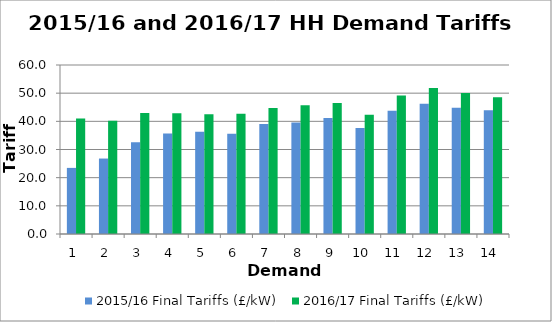
| Category | 2015/16 Final Tariffs (£/kW) | 2016/17 Final Tariffs (£/kW) |
|---|---|---|
| 1.0 | 23.469 | 40.966 |
| 2.0 | 26.789 | 40.244 |
| 3.0 | 32.618 | 42.928 |
| 4.0 | 35.683 | 42.828 |
| 5.0 | 36.288 | 42.494 |
| 6.0 | 35.621 | 42.678 |
| 7.0 | 39.066 | 44.725 |
| 8.0 | 39.63 | 45.739 |
| 9.0 | 41.176 | 46.543 |
| 10.0 | 37.609 | 42.307 |
| 11.0 | 43.739 | 49.204 |
| 12.0 | 46.237 | 51.87 |
| 13.0 | 44.787 | 50.078 |
| 14.0 | 43.979 | 48.58 |